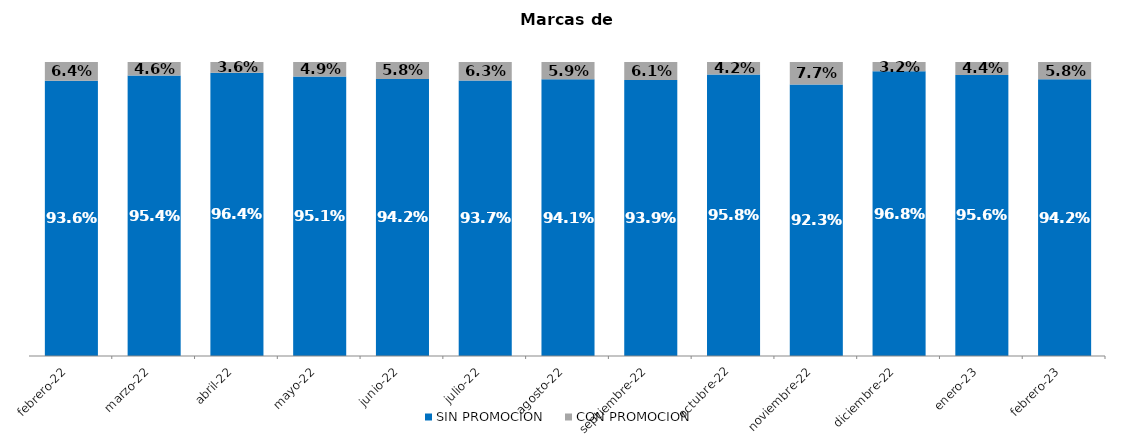
| Category | SIN PROMOCION   | CON PROMOCION   |
|---|---|---|
| 2022-02-01 | 0.936 | 0.064 |
| 2022-03-01 | 0.954 | 0.046 |
| 2022-04-01 | 0.964 | 0.036 |
| 2022-05-01 | 0.951 | 0.049 |
| 2022-06-01 | 0.942 | 0.058 |
| 2022-07-01 | 0.937 | 0.063 |
| 2022-08-01 | 0.941 | 0.059 |
| 2022-09-01 | 0.939 | 0.061 |
| 2022-10-01 | 0.958 | 0.042 |
| 2022-11-01 | 0.923 | 0.077 |
| 2022-12-01 | 0.968 | 0.032 |
| 2023-01-01 | 0.956 | 0.044 |
| 2023-02-01 | 0.942 | 0.058 |